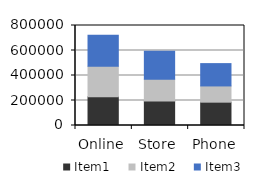
| Category | Item1 | Item2 | Item3 |
|---|---|---|---|
| Online | 229880 | 244885 | 247609 |
| Store | 195635 | 173885 | 224595 |
| Phone | 186630 | 129833 | 178649 |